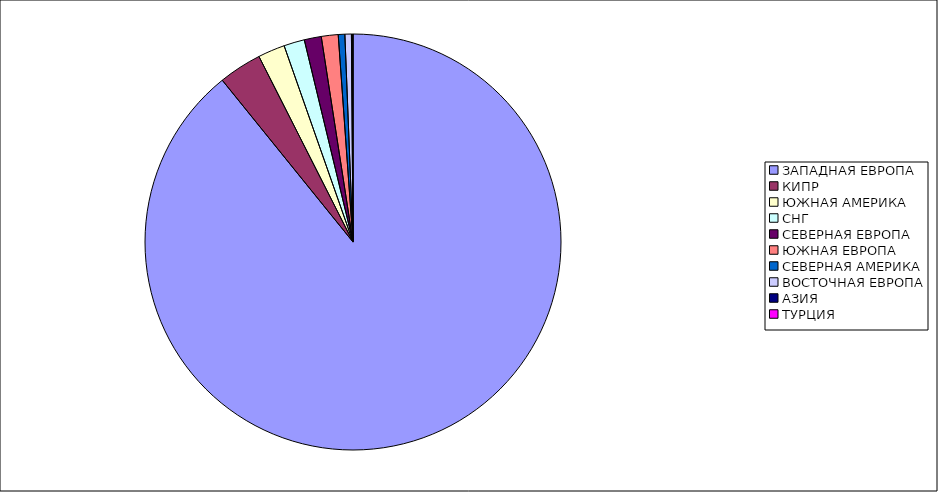
| Category | Оборот |
|---|---|
| ЗАПАДНАЯ ЕВРОПА | 0.892 |
| КИПР | 0.034 |
| ЮЖНАЯ АМЕРИКА | 0.021 |
| СНГ | 0.016 |
| СЕВЕРНАЯ ЕВРОПА | 0.013 |
| ЮЖНАЯ ЕВРОПА | 0.013 |
| СЕВЕРНАЯ АМЕРИКА | 0.005 |
| ВОСТОЧНАЯ ЕВРОПА | 0.005 |
| АЗИЯ | 0.001 |
| ТУРЦИЯ | 0 |